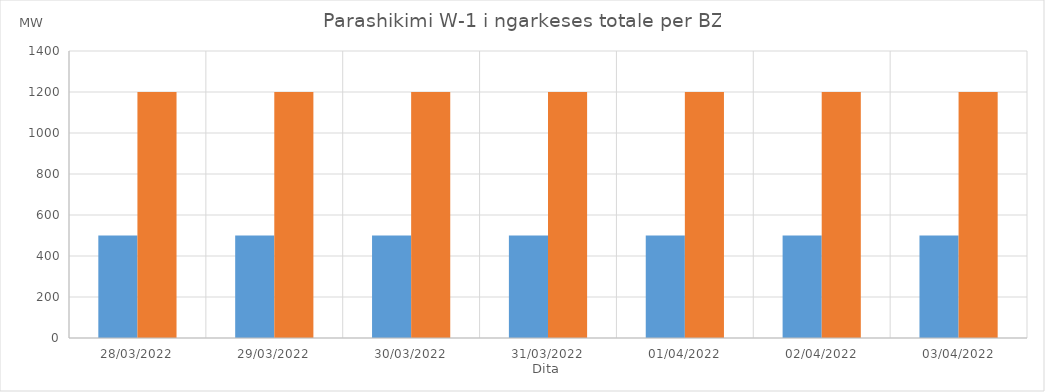
| Category | Min (MW) | Max (MW) |
|---|---|---|
| 28/03/2022 | 500 | 1200 |
| 29/03/2022 | 500 | 1200 |
| 30/03/2022 | 500 | 1200 |
| 31/03/2022 | 500 | 1200 |
| 01/04/2022 | 500 | 1200 |
| 02/04/2022 | 500 | 1200 |
| 03/04/2022 | 500 | 1200 |